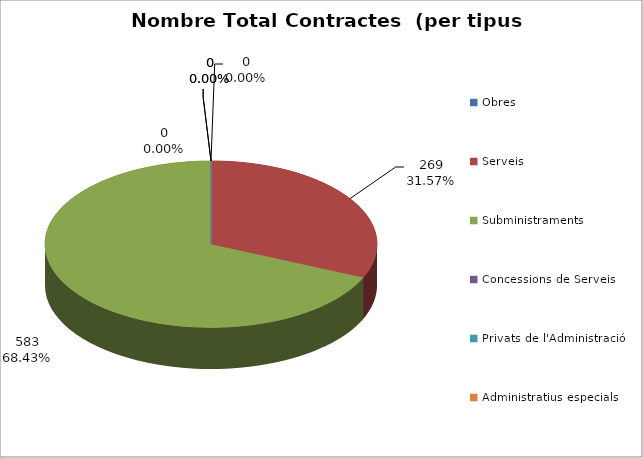
| Category | Nombre Total Contractes |
|---|---|
| Obres | 0 |
| Serveis | 269 |
| Subministraments | 583 |
| Concessions de Serveis | 0 |
| Privats de l'Administració | 0 |
| Administratius especials | 0 |